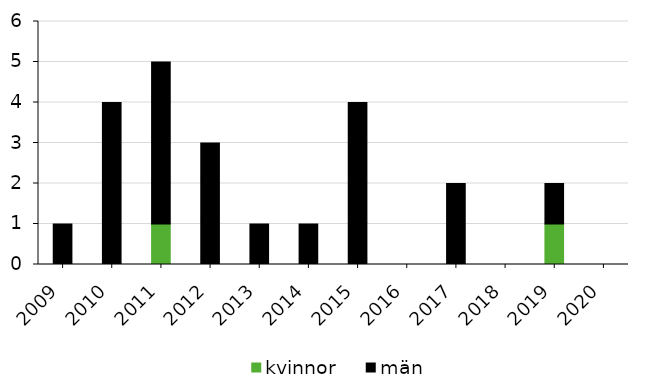
| Category | kvinnor | män |
|---|---|---|
| 2009 | 0 | 1 |
| 2010 | 0 | 4 |
| 2011 | 1 | 4 |
| 2012 | 0 | 3 |
| 2013 | 0 | 1 |
| 2014 | 0 | 1 |
| 2015 | 0 | 4 |
| 2016 | 0 | 0 |
| 2017 | 0 | 2 |
| 2018 | 0 | 0 |
| 2019 | 1 | 1 |
| 2020 | 0 | 0 |